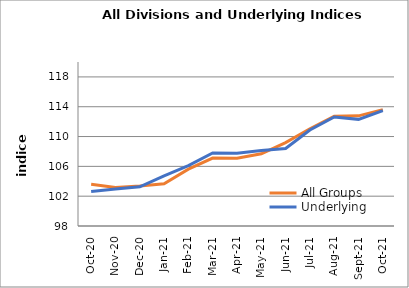
| Category | All Groups | Underlying |
|---|---|---|
| 2020-10-01 | 103.588 | 102.619 |
| 2020-11-01 | 103.171 | 102.969 |
| 2020-12-01 | 103.378 | 103.266 |
| 2021-01-01 | 103.671 | 104.733 |
| 2021-02-01 | 105.627 | 106.099 |
| 2021-03-01 | 107.11 | 107.788 |
| 2021-04-01 | 107.082 | 107.772 |
| 2021-05-01 | 107.693 | 108.128 |
| 2021-06-01 | 109.193 | 108.399 |
| 2021-07-01 | 111.039 | 110.883 |
| 2021-08-01 | 112.735 | 112.633 |
| 2021-09-01 | 112.778 | 112.306 |
| 2021-10-01 | 113.609 | 113.469 |